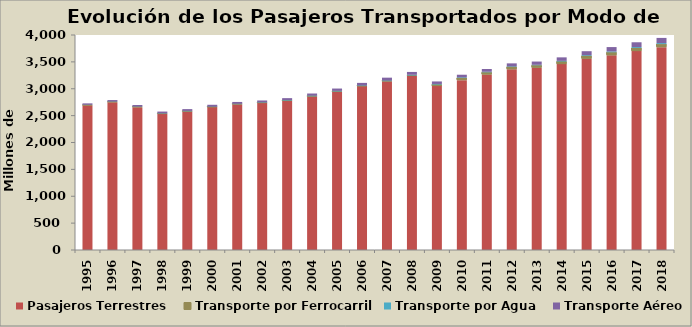
| Category | Pasajeros Terrestres | Transporte por Ferrocarril | Transporte por Agua | Transporte Aéreo |
|---|---|---|---|---|
| 1995.0 | 2691 | 6.678 | 5.098 | 25.192 |
| 1996.0 | 2750 | 6.727 | 6.394 | 26.493 |
| 1997.0 | 2658 | 5.092 | 6.228 | 28.896 |
| 1998.0 | 2536 | 1.576 | 7.179 | 30.922 |
| 1999.0 | 2580 | 0.801 | 7.854 | 32.662 |
| 2000.0 | 2660 | 0.334 | 7.4 | 33.974 |
| 2001.0 | 2713 | 0.242 | 7.507 | 33.673 |
| 2002.0 | 2740 | 0.237 | 8.715 | 33.19 |
| 2003.0 | 2780 | 0.27 | 9.843 | 35.287 |
| 2004.0 | 2860 | 0.253 | 11.744 | 39.422 |
| 2005.0 | 2950 | 0.253 | 11.461 | 42.176 |
| 2006.0 | 3050 | 0.26 | 11.985 | 46.705 |
| 2007.0 | 3141 | 0.288 | 12.761 | 52.217 |
| 2008.0 | 3238 | 8.915 | 12.597 | 53.3 |
| 2009.0 | 3050 | 28 | 10.985 | 46.971 |
| 2010.0 | 3160 | 40.398 | 11.793 | 48.698 |
| 2011.0 | 3264.3 | 41.922 | 10.814 | 50.764 |
| 2012.0 | 3363 | 43.83 | 10.268 | 55.153 |
| 2013.0 | 3391 | 45.288 | 9.969 | 60.007 |
| 2014.0 | 3459 | 47.888 | 11.948 | 65.135 |
| 2015.0 | 3558 | 53.594 | 13.685 | 73.265 |
| 2016.0 | 3623 | 55.766 | 15.272 | 81.286 |
| 2017.0 | 3701 | 56.715 | 17.429 | 89.641 |
| 2018.0 | 3773 | 57.757 | 18.688 | 96.406 |